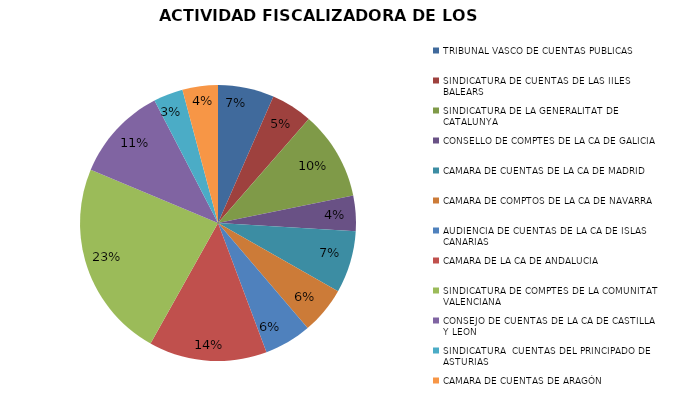
| Category | Series 0 |
|---|---|
| TRIBUNAL VASCO DE CUENTAS PUBLICAS | 19 |
| SINDICATURA DE CUENTAS DE LAS IILES BALEARS | 14 |
| SINDICATURA DE LA GENERALITAT DE CATALUNYA | 30 |
| CONSELLO DE COMPTES DE LA CA DE GALICIA | 12 |
| CAMARA DE CUENTAS DE LA CA DE MADRID | 21 |
| CAMARA DE COMPTOS DE LA CA DE NAVARRA | 16 |
| AUDIENCIA DE CUENTAS DE LA CA DE ISLAS CANARIAS | 16 |
| CAMARA DE LA CA DE ANDALUCIA | 40 |
| SINDICATURA DE COMPTES DE LA COMUNITAT VALENCIANA | 67 |
| CONSEJO DE CUENTAS DE LA CA DE CASTILLA Y LEON | 32 |
| SINDICATURA  CUENTAS DEL PRINCIPADO DE ASTURIAS | 10 |
| CAMARA DE CUENTAS DE ARAGÓN | 12 |